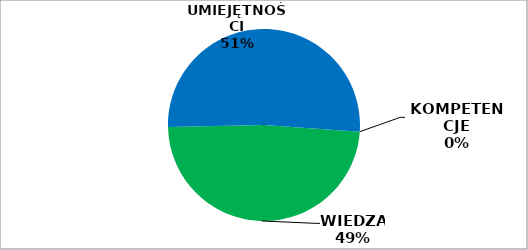
| Category | Series 0 |
|---|---|
| WIEDZA | 475 |
| UMIEJĘTNOŚCI | 503 |
| KOMPETENCJE | 0 |